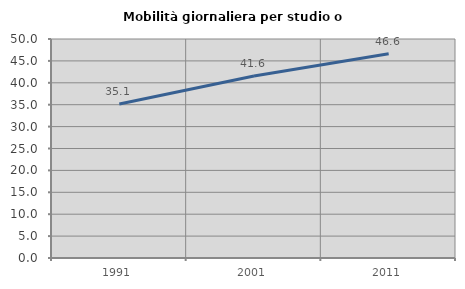
| Category | Mobilità giornaliera per studio o lavoro |
|---|---|
| 1991.0 | 35.142 |
| 2001.0 | 41.561 |
| 2011.0 | 46.618 |